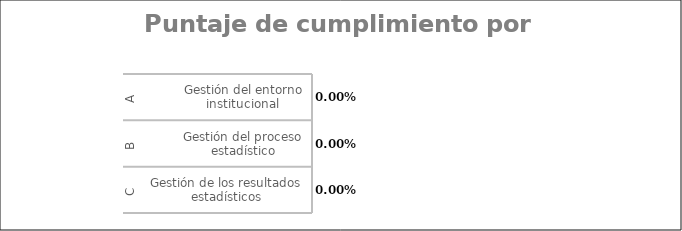
| Category | Total |
|---|---|
| 0 | 0 |
| 1 | 0 |
| 2 | 0 |